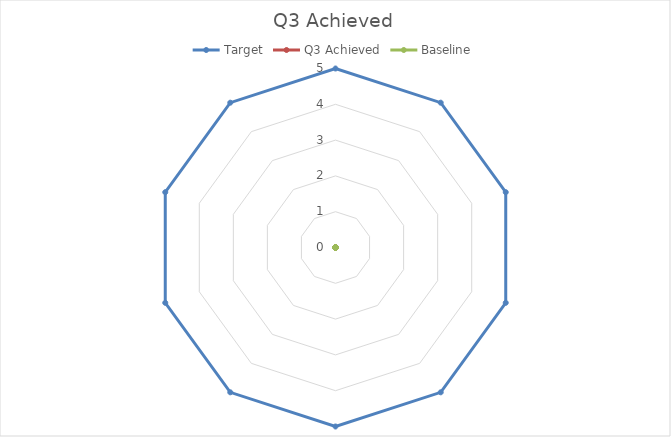
| Category | Target | Q3 Achieved | Baseline |
|---|---|---|---|
|  | 5 |  |  |
|  | 5 |  |  |
|  | 5 |  |  |
|  | 5 |  |  |
|  | 5 |  |  |
|  | 5 |  |  |
|  | 5 |  |  |
|  | 5 |  |  |
|  | 5 |  |  |
|  | 5 |  |  |